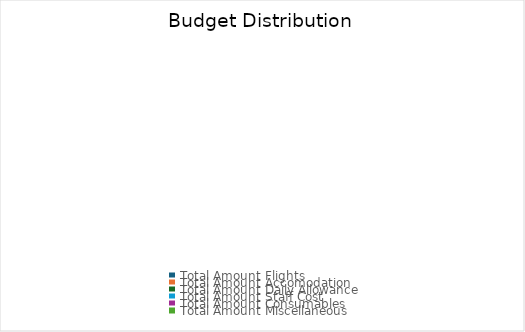
| Category | Series 0 |
|---|---|
| Total Amount Flights | 0 |
| Total Amount Accomodation | 0 |
| Total Amount Daily Allowance | 0 |
| Total Amount Staff Cost | 0 |
| Total Amount Consumables | 0 |
| Total Amount Miscellaneous | 0 |